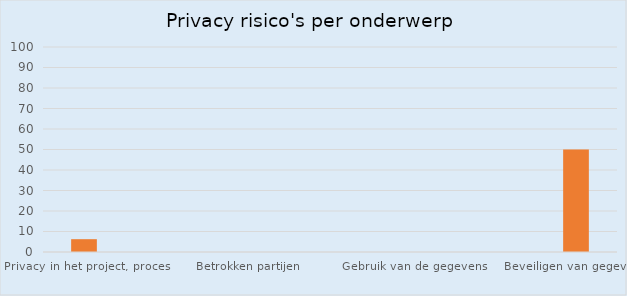
| Category | Percentage  |
|---|---|
| Privacy in het project, proces | 6.25 |
| Gegevens die worden gebruikt | 0 |
| Betrokken partijen | 0 |
| Verzamelen van de gegegevens | 0 |
| Gebruik van de gegevens | 0 |
| Bewaren en vernietigen  | 0 |
| Beveiligen van gegevens.  | 50 |